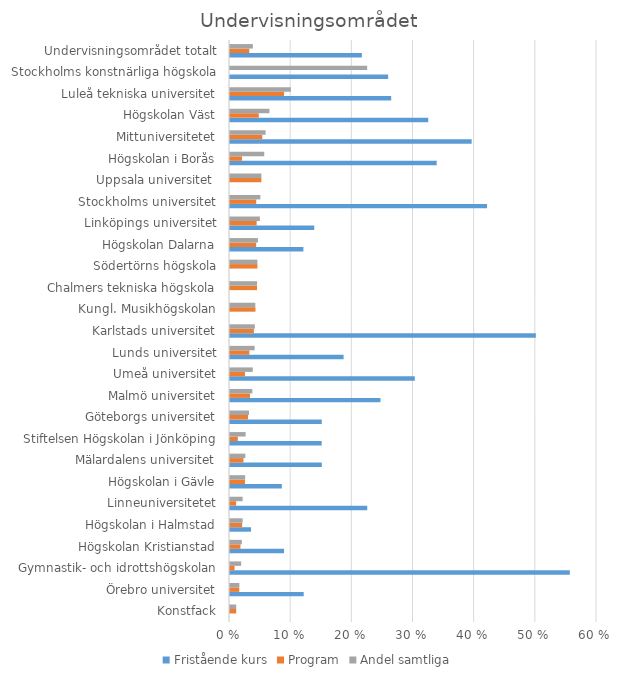
| Category | Fristående kurs | Program | Andel samtliga |
|---|---|---|---|
| Konstfack | 0 | 0.01 | 0.01 |
| Örebro universitet | 0.12 | 0.015 | 0.015 |
| Gymnastik- och idrottshögskolan | 0.556 | 0.007 | 0.018 |
| Högskolan Kristianstad | 0.088 | 0.017 | 0.019 |
| Högskolan i Halmstad | 0.034 | 0.02 | 0.021 |
| Linneuniversitetet | 0.224 | 0.01 | 0.021 |
| Högskolan i Gävle | 0.085 | 0.024 | 0.025 |
| Mälardalens universitet | 0.15 | 0.022 | 0.025 |
| Stiftelsen Högskolan i Jönköping | 0.15 | 0.013 | 0.026 |
| Göteborgs universitet | 0.15 | 0.029 | 0.031 |
| Malmö universitet | 0.246 | 0.033 | 0.037 |
| Umeå universitet | 0.302 | 0.024 | 0.037 |
| Lunds universitet | 0.186 | 0.032 | 0.04 |
| Karlstads universitet | 0.5 | 0.039 | 0.041 |
| Kungl. Musikhögskolan | 0 | 0.042 | 0.041 |
| Chalmers tekniska högskola | 0 | 0.044 | 0.044 |
| Södertörns högskola | 0 | 0.045 | 0.045 |
| Högskolan Dalarna | 0.12 | 0.043 | 0.046 |
| Linköpings universitet | 0.138 | 0.044 | 0.049 |
| Stockholms universitet | 0.42 | 0.043 | 0.05 |
| Uppsala universitet  | 0 | 0.051 | 0.051 |
| Högskolan i Borås | 0.338 | 0.02 | 0.056 |
| Mittuniversitetet | 0.395 | 0.053 | 0.058 |
| Högskolan Väst | 0.324 | 0.047 | 0.064 |
| Luleå tekniska universitet | 0.264 | 0.088 | 0.1 |
| Stockholms konstnärliga högskola | 0.259 | 0 | 0.224 |
| Undervisningsområdet totalt | 0.216 | 0.032 | 0.037 |